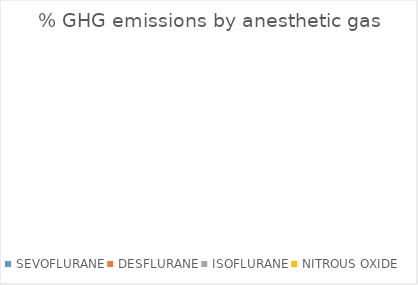
| Category | Series 0 |
|---|---|
| SEVOFLURANE | 0 |
| DESFLURANE | 0 |
| ISOFLURANE | 0 |
| NITROUS OXIDE | 0 |